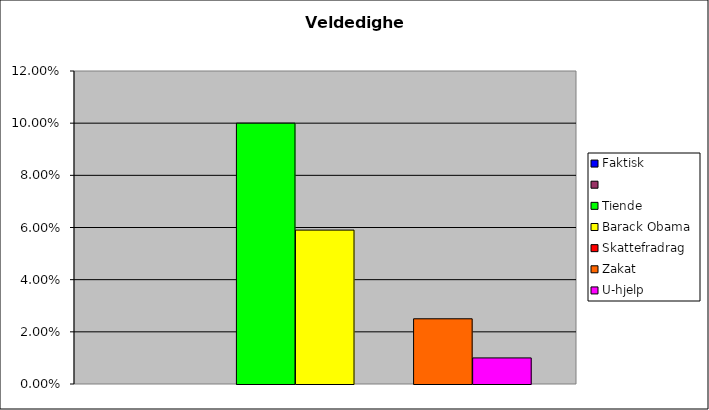
| Category | Faktisk | Series 1 | Tiende | Barack Obama | Skattefradrag | Zakat | U-hjelp |
|---|---|---|---|---|---|---|---|
| 0 | 0 |  | 0.1 | 0.059 | 0 | 0.025 | 0.01 |